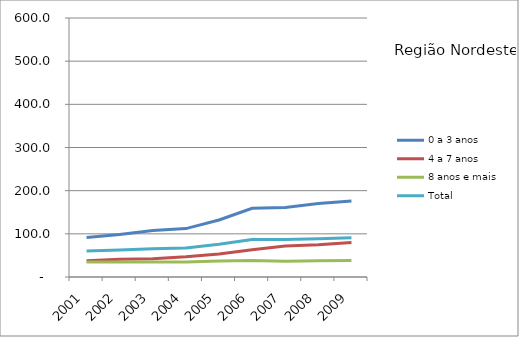
| Category | 0 a 3 anos | 4 a 7 anos | 8 anos e mais | Total |
|---|---|---|---|---|
| 2001.0 | 91.7 | 37.7 | 34.7 | 60.1 |
| 2002.0 | 98.6 | 40.9 | 35 | 62.7 |
| 2003.0 | 107.9 | 42.4 | 35 | 65.6 |
| 2004.0 | 112.1 | 46.9 | 34.7 | 67.1 |
| 2005.0 | 132.1 | 53.4 | 37 | 75.8 |
| 2006.0 | 159.1 | 63.2 | 38.5 | 86.6 |
| 2007.0 | 160.8 | 71.6 | 36.2 | 86.9 |
| 2008.0 | 170 | 74.5 | 37.4 | 88.6 |
| 2009.0 | 176.2 | 79.7 | 38.2 | 91 |